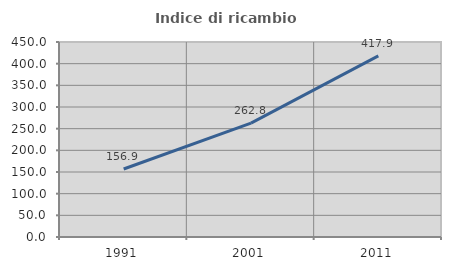
| Category | Indice di ricambio occupazionale  |
|---|---|
| 1991.0 | 156.923 |
| 2001.0 | 262.762 |
| 2011.0 | 417.888 |